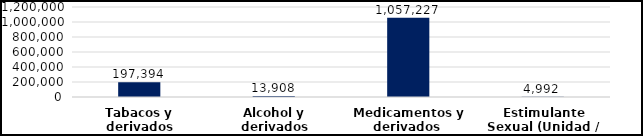
| Category | Series 0 |
|---|---|
| Tabacos y derivados (Unidad) | 197394 |
| Alcohol y derivados (Botellas) | 13908 |
| Medicamentos y derivados  (Unidad) | 1057227 |
| Estimulante Sexual (Unidad / Frasco) | 4992 |